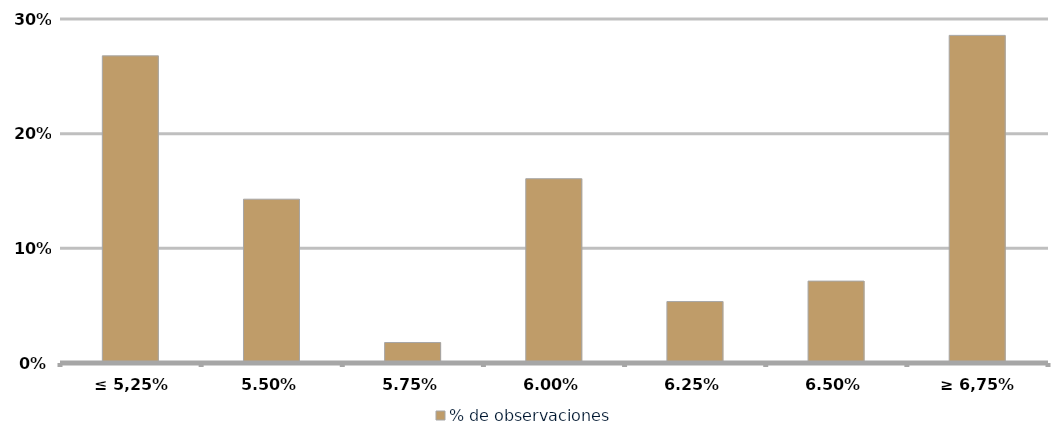
| Category | % de observaciones  |
|---|---|
| ≤ 5,25% | 0.268 |
| 5,50% | 0.143 |
| 5,75% | 0.018 |
| 6,00% | 0.161 |
| 6,25% | 0.054 |
| 6,50% | 0.071 |
| ≥ 6,75% | 0.286 |